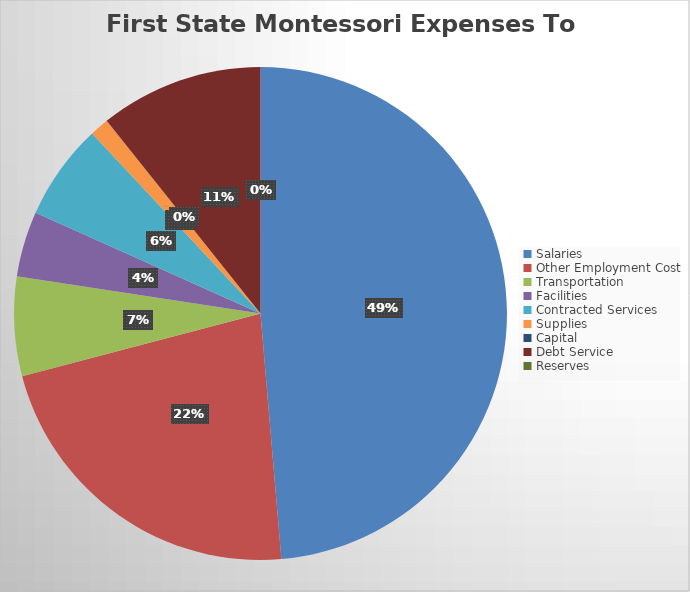
| Category | Series 0 |
|---|---|
| Salaries | 3487772.2 |
| Other Employment Cost | 1595059.53 |
| Transportation | 466988.44 |
| Facilities | 307876.48 |
| Contracted Services | 453429.52 |
| Supplies | 89291.53 |
| Capital | 0 |
| Debt Service | 768822.52 |
| Reserves | 0 |